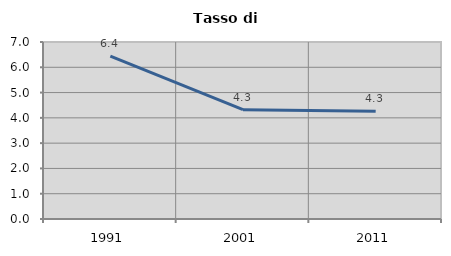
| Category | Tasso di disoccupazione   |
|---|---|
| 1991.0 | 6.44 |
| 2001.0 | 4.322 |
| 2011.0 | 4.261 |